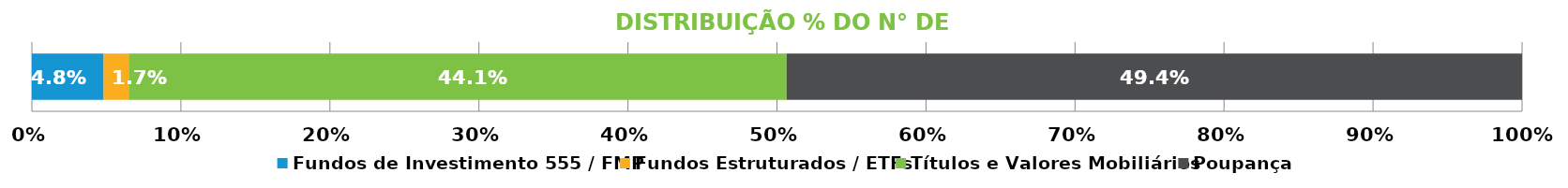
| Category | Fundos de Investimento 555 / FMP | Fundos Estruturados / ETFs | Títulos e Valores Mobiliários | Poupança |
|---|---|---|---|---|
| 0 | 0.048 | 0.017 | 0.441 | 0.494 |